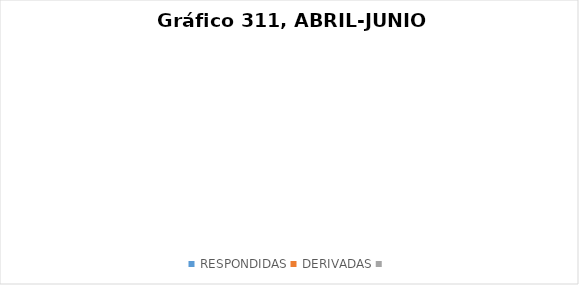
| Category | Series 0 |
|---|---|
| RESPONDIDAS | 0 |
| DERIVADAS | 0 |